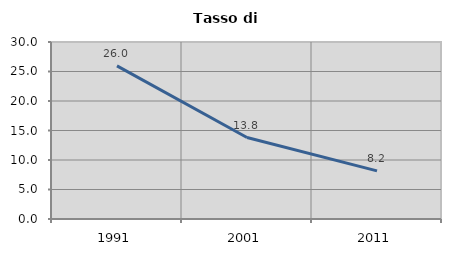
| Category | Tasso di disoccupazione   |
|---|---|
| 1991.0 | 25.961 |
| 2001.0 | 13.807 |
| 2011.0 | 8.163 |